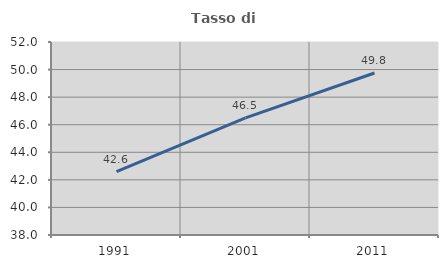
| Category | Tasso di occupazione   |
|---|---|
| 1991.0 | 42.593 |
| 2001.0 | 46.5 |
| 2011.0 | 49.751 |